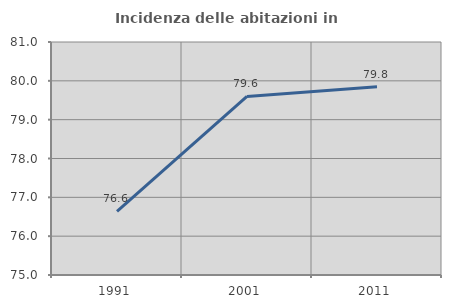
| Category | Incidenza delle abitazioni in proprietà  |
|---|---|
| 1991.0 | 76.639 |
| 2001.0 | 79.597 |
| 2011.0 | 79.85 |